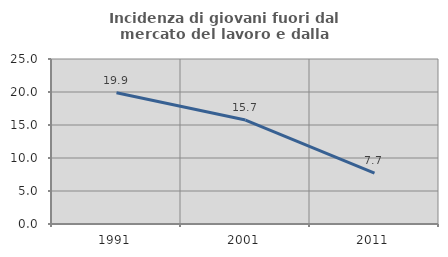
| Category | Incidenza di giovani fuori dal mercato del lavoro e dalla formazione  |
|---|---|
| 1991.0 | 19.88 |
| 2001.0 | 15.748 |
| 2011.0 | 7.692 |